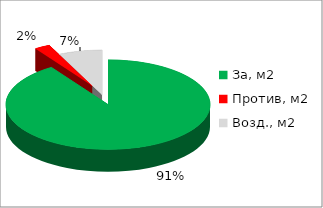
| Category | Series 0 |
|---|---|
| За, м2 | 0.906 |
| Против, м2 | 0.025 |
| Возд., м2 | 0.069 |